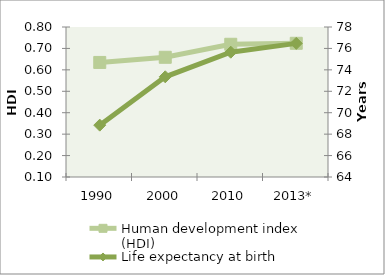
| Category | Human development index (HDI) |
|---|---|
| 1990 | 0.635 |
| 2000 | 0.659 |
| 2010 | 0.719 |
| 2013* | 0.724 |